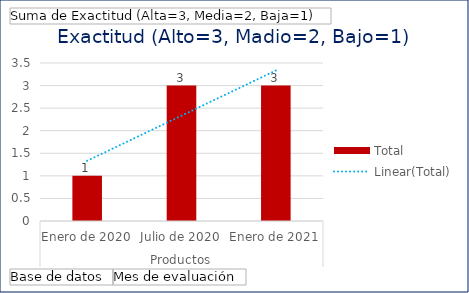
| Category | Total |
|---|---|
| 0 | 1 |
| 1 | 3 |
| 2 | 3 |